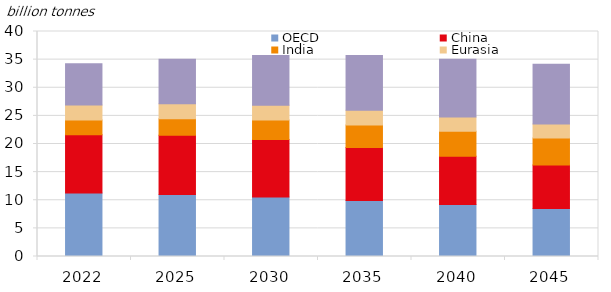
| Category | OECD | China | India | Eurasia | Other non-OECD |
|---|---|---|---|---|---|
| 2022.0 | 11.277 | 10.385 | 2.62 | 2.664 | 7.34 |
| 2025.0 | 11.024 | 10.542 | 2.905 | 2.663 | 7.937 |
| 2030.0 | 10.593 | 10.197 | 3.467 | 2.642 | 8.841 |
| 2035.0 | 9.96 | 9.44 | 3.99 | 2.606 | 9.755 |
| 2040.0 | 9.25 | 8.562 | 4.447 | 2.555 | 10.24 |
| 2045.0 | 8.517 | 7.737 | 4.83 | 2.491 | 10.609 |